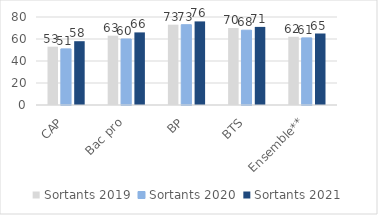
| Category | Sortants 2019 | Sortants 2020 | Sortants 2021 |
|---|---|---|---|
| CAP | 53 | 51 | 58 |
| Bac pro | 63 | 60 | 66 |
| BP | 73 | 73 | 76 |
| BTS | 70 | 68 | 71 |
| Ensemble** | 62 | 61 | 65 |